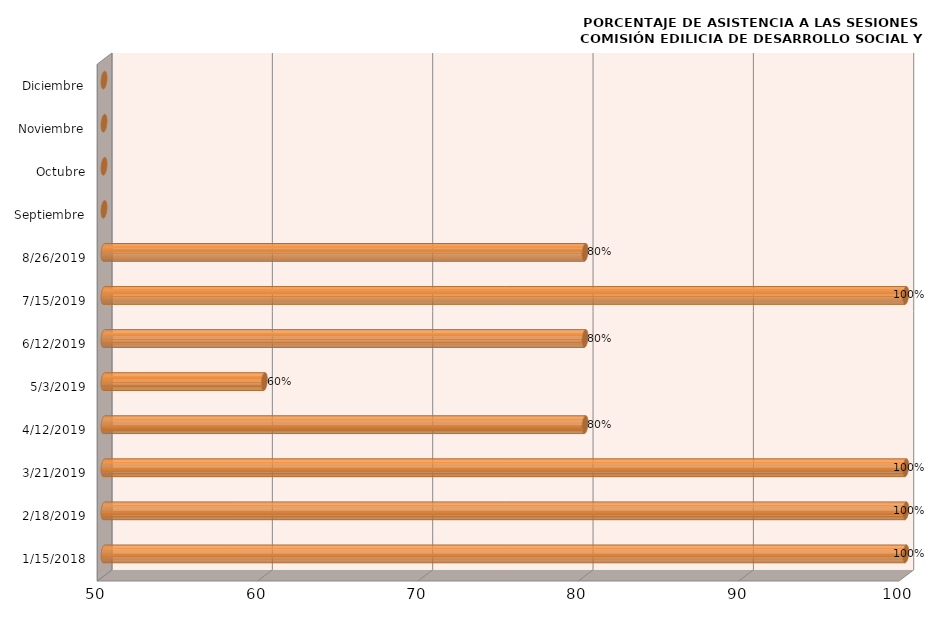
| Category | Series 0 |
|---|---|
| 15/01/2018 | 100 |
| 18/02/2019 | 100 |
| 21/03/2019 | 100 |
| 12/04/2019 | 80 |
| 03/05/2019 | 60 |
| 12/06/2019 | 80 |
| 15/07/2019 | 100 |
| 26/08/2019 | 80 |
| Septiembre | 0 |
| Octubre | 0 |
| Noviembre | 0 |
| Diciembre | 0 |